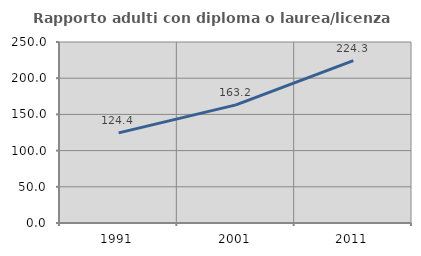
| Category | Rapporto adulti con diploma o laurea/licenza media  |
|---|---|
| 1991.0 | 124.429 |
| 2001.0 | 163.18 |
| 2011.0 | 224.322 |